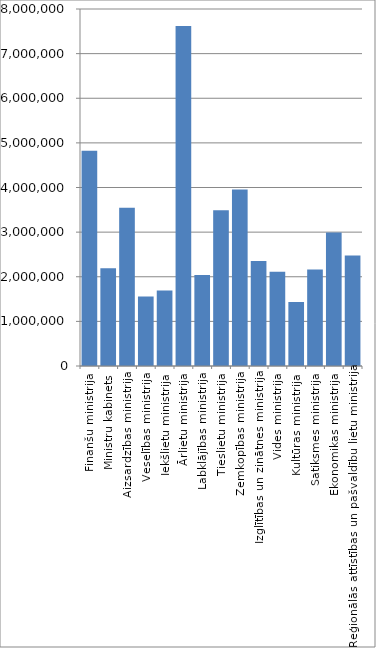
| Category | Series 0 |
|---|---|
| Finanšu ministrija | 4821258 |
| Ministru kabinets | 2193254 |
| Aizsardzības ministrija | 3546766 |
| Veselības ministrija | 1555694 |
| Iekšlietu ministrija | 1689160 |
| Ārlietu ministrija | 7616650 |
| Labklājības ministrija | 2037084 |
| Tieslietu ministrija | 3487699 |
| Zemkopības ministrija | 3957893 |
| Izglītības un zinātnes ministrija | 2353728 |
| Vides ministrija | 2113937 |
| Kultūras ministrija | 1432850 |
| Satiksmes ministrija | 2160419 |
| Ekonomikas ministrija | 2989152 |
| Reģionālās attīstības un pašvaldību lietu ministrija | 2476519 |